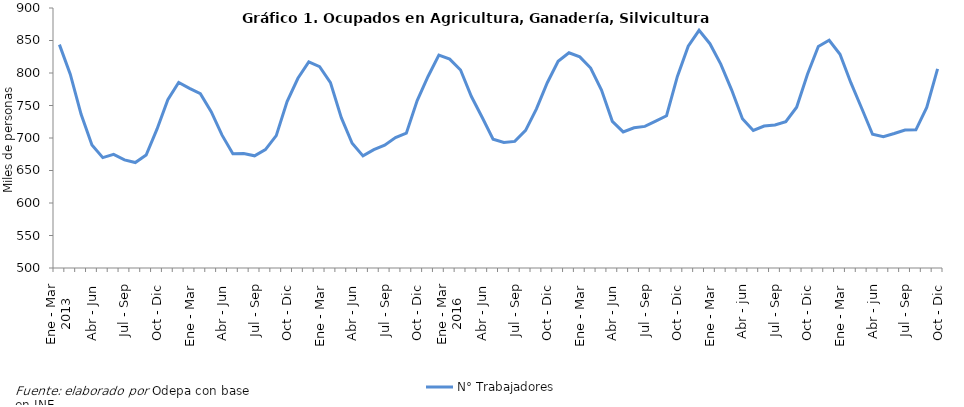
| Category | N° Trabajadores |
|---|---|
| 0 | 843.658 |
| 1 | 798.266 |
| 2 | 736.461 |
| 3 | 689.358 |
| 4 | 669.839 |
| 5 | 674.791 |
| 6 | 666.406 |
| 7 | 662.262 |
| 8 | 673.724 |
| 9 | 713.604 |
| 10 | 758.988 |
| 11 | 785.537 |
| 12 | 776.373 |
| 13 | 768.303 |
| 14 | 740.609 |
| 15 | 704.367 |
| 16 | 675.938 |
| 17 | 676.058 |
| 18 | 672.6 |
| 19 | 682.074 |
| 20 | 703.599 |
| 21 | 755.905 |
| 22 | 791.902 |
| 23 | 817.027 |
| 24 | 809.646 |
| 25 | 785.301 |
| 26 | 731.282 |
| 27 | 691.978 |
| 28 | 672.526 |
| 29 | 682.164 |
| 30 | 689.034 |
| 31 | 700.719 |
| 32 | 707.439 |
| 33 | 757.522 |
| 34 | 794.669 |
| 35 | 827.605 |
| 36 | 821.367 |
| 37 | 804.582 |
| 38 | 763.826 |
| 39 | 731.558 |
| 40 | 698.04 |
| 41 | 692.989 |
| 42 | 694.776 |
| 43 | 711.757 |
| 44 | 744.739 |
| 45 | 785.03 |
| 46 | 818.051 |
| 47 | 831.11 |
| 48 | 824.789 |
| 49 | 807.606 |
| 50 | 773.662 |
| 51 | 725.597 |
| 52 | 709.369 |
| 53 | 715.675 |
| 54 | 717.856 |
| 55 | 725.965 |
| 56 | 734.277 |
| 57 | 794.66 |
| 58 | 841.147 |
| 59 | 865.659 |
| 60 | 845.074 |
| 61 | 813.586 |
| 62 | 774.131 |
| 63 | 729.695 |
| 64 | 711.581 |
| 65 | 718.419 |
| 66 | 720.091 |
| 67 | 725.105 |
| 68 | 747.425 |
| 69 | 798.027 |
| 70 | 840.667 |
| 71 | 850.292 |
| 72 | 828.766 |
| 73 | 785.1 |
| 74 | 745.744 |
| 75 | 705.675 |
| 76 | 702.138 |
| 77 | 706.921 |
| 78 | 712.332 |
| 79 | 712.629 |
| 80 | 747.153 |
| 81 | 806.361 |